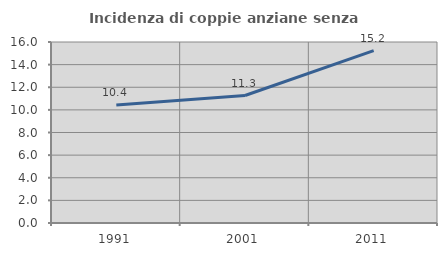
| Category | Incidenza di coppie anziane senza figli  |
|---|---|
| 1991.0 | 10.43 |
| 2001.0 | 11.268 |
| 2011.0 | 15.232 |